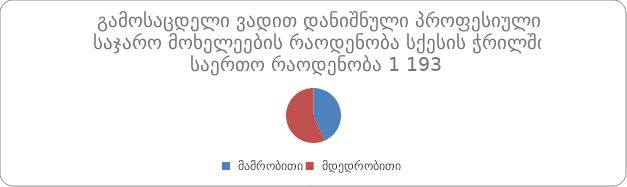
| Category | რაოდენობა |
|---|---|
|  მამრობითი | 516 |
|  მდედრობითი | 677 |